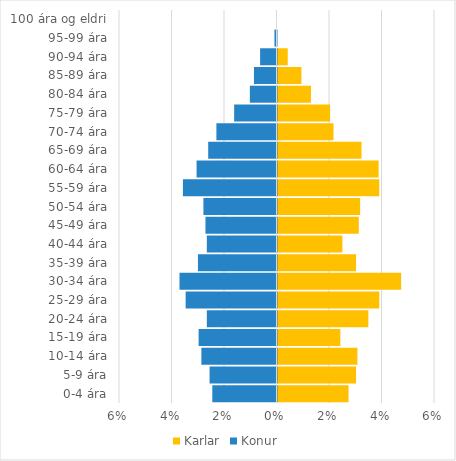
| Category | Karlar | Konur |
|---|---|---|
| 0-4 ára | 0.027 | -0.024 |
| 5-9 ára | 0.03 | -0.026 |
| 10-14 ára | 0.03 | -0.029 |
| 15-19 ára | 0.024 | -0.03 |
| 20-24 ára | 0.035 | -0.027 |
| 25-29 ára | 0.039 | -0.035 |
| 30-34 ára | 0.047 | -0.037 |
| 35-39 ára | 0.03 | -0.03 |
| 40-44 ára | 0.025 | -0.027 |
| 45-49 ára | 0.031 | -0.027 |
| 50-54 ára | 0.031 | -0.028 |
| 55-59 ára | 0.039 | -0.036 |
| 60-64 ára | 0.039 | -0.03 |
| 65-69 ára | 0.032 | -0.026 |
| 70-74 ára | 0.021 | -0.023 |
| 75-79 ára | 0.02 | -0.016 |
| 80-84 ára | 0.013 | -0.01 |
| 85-89 ára | 0.009 | -0.009 |
| 90-94 ára | 0.004 | -0.006 |
| 95-99 ára | 0 | -0.001 |
| 100 ára og eldri | 0 | 0 |